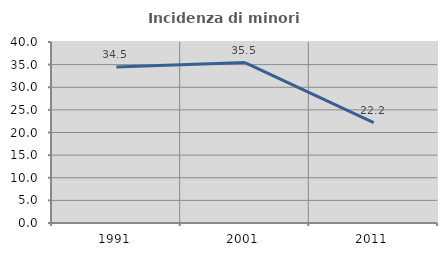
| Category | Incidenza di minori stranieri |
|---|---|
| 1991.0 | 34.483 |
| 2001.0 | 35.461 |
| 2011.0 | 22.2 |